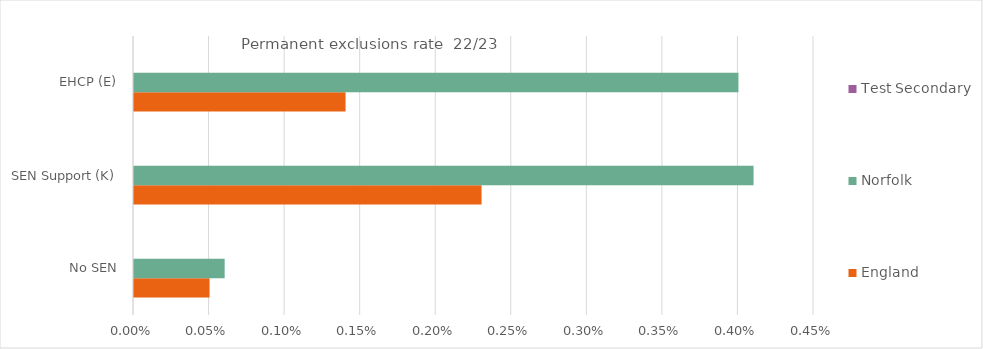
| Category | England | Norfolk | Test Secondary |
|---|---|---|---|
| No SEN | 0.001 | 0.001 |  |
| SEN Support (K) | 0.002 | 0.004 |  |
| EHCP (E) | 0.001 | 0.004 |  |